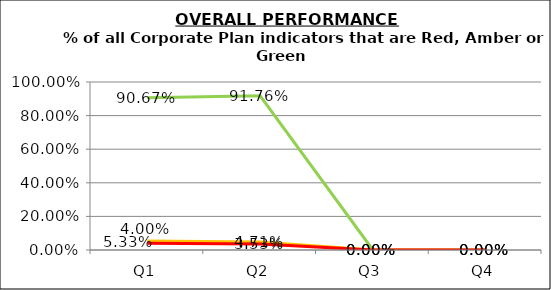
| Category | Green | Amber | Red |
|---|---|---|---|
| Q1 | 0.907 | 0.053 | 0.04 |
| Q2 | 0.918 | 0.047 | 0.035 |
| Q3 | 0 | 0 | 0 |
| Q4 | 0 | 0 | 0 |